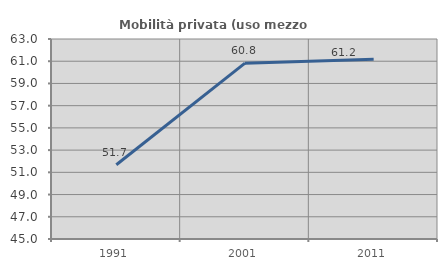
| Category | Mobilità privata (uso mezzo privato) |
|---|---|
| 1991.0 | 51.683 |
| 2001.0 | 60.825 |
| 2011.0 | 61.167 |